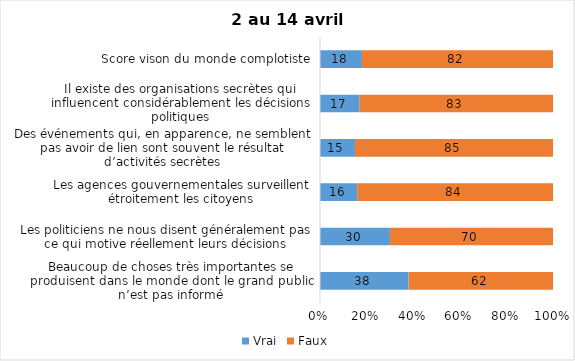
| Category | Vrai | Faux |
|---|---|---|
| Beaucoup de choses très importantes se produisent dans le monde dont le grand public n’est pas informé | 38 | 62 |
| Les politiciens ne nous disent généralement pas ce qui motive réellement leurs décisions | 30 | 70 |
| Les agences gouvernementales surveillent étroitement les citoyens | 16 | 84 |
| Des événements qui, en apparence, ne semblent pas avoir de lien sont souvent le résultat d’activités secrètes | 15 | 85 |
| Il existe des organisations secrètes qui influencent considérablement les décisions politiques | 17 | 83 |
| Score vison du monde complotiste | 18 | 82 |